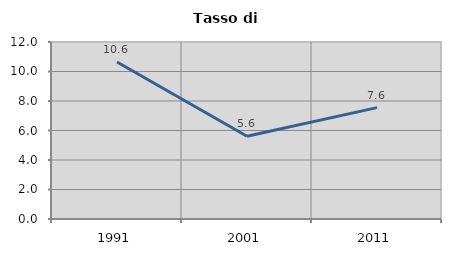
| Category | Tasso di disoccupazione   |
|---|---|
| 1991.0 | 10.641 |
| 2001.0 | 5.61 |
| 2011.0 | 7.553 |